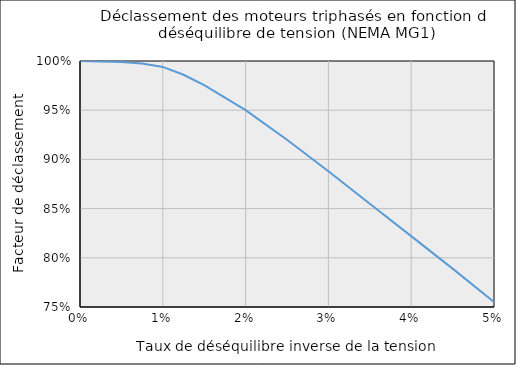
| Category | Series 0 |
|---|---|
| 0.0 | 1 |
| 0.005 | 0.999 |
| 0.0075 | 0.998 |
| 0.01 | 0.994 |
| 0.0125 | 0.986 |
| 0.015 | 0.976 |
| 0.02 | 0.95 |
| 0.025 | 0.92 |
| 0.03 | 0.888 |
| 0.035 | 0.855 |
| 0.04 | 0.822 |
| 0.045 | 0.789 |
| 0.05 | 0.755 |